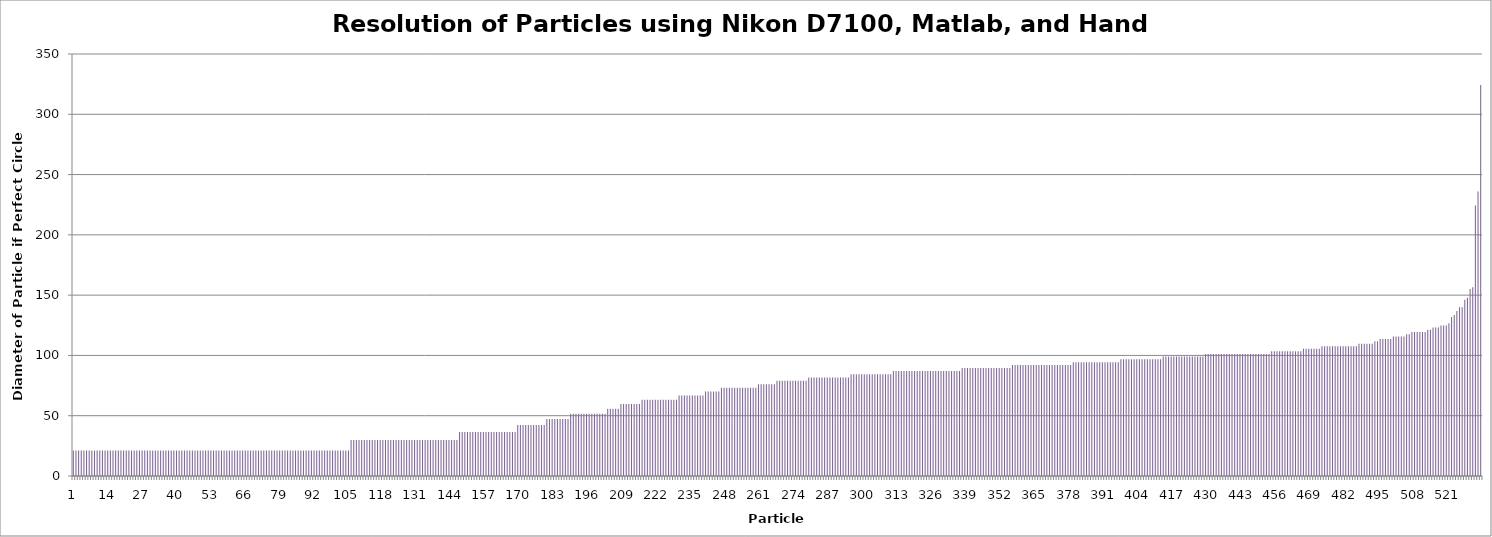
| Category | Matlab Diameter if Perfect Circle (um) |
|---|---|
| 0 | 21.11 |
| 1 | 21.11 |
| 2 | 21.11 |
| 3 | 21.11 |
| 4 | 21.11 |
| 5 | 21.11 |
| 6 | 21.11 |
| 7 | 21.11 |
| 8 | 21.11 |
| 9 | 21.11 |
| 10 | 21.11 |
| 11 | 21.11 |
| 12 | 21.11 |
| 13 | 21.11 |
| 14 | 21.11 |
| 15 | 21.11 |
| 16 | 21.11 |
| 17 | 21.11 |
| 18 | 21.11 |
| 19 | 21.11 |
| 20 | 21.11 |
| 21 | 21.11 |
| 22 | 21.11 |
| 23 | 21.11 |
| 24 | 21.11 |
| 25 | 21.11 |
| 26 | 21.11 |
| 27 | 21.11 |
| 28 | 21.11 |
| 29 | 21.11 |
| 30 | 21.11 |
| 31 | 21.11 |
| 32 | 21.11 |
| 33 | 21.11 |
| 34 | 21.11 |
| 35 | 21.11 |
| 36 | 21.11 |
| 37 | 21.11 |
| 38 | 21.11 |
| 39 | 21.11 |
| 40 | 21.11 |
| 41 | 21.11 |
| 42 | 21.11 |
| 43 | 21.11 |
| 44 | 21.11 |
| 45 | 21.11 |
| 46 | 21.11 |
| 47 | 21.11 |
| 48 | 21.11 |
| 49 | 21.11 |
| 50 | 21.11 |
| 51 | 21.11 |
| 52 | 21.11 |
| 53 | 21.11 |
| 54 | 21.11 |
| 55 | 21.11 |
| 56 | 21.11 |
| 57 | 21.11 |
| 58 | 21.11 |
| 59 | 21.11 |
| 60 | 21.11 |
| 61 | 21.11 |
| 62 | 21.11 |
| 63 | 21.11 |
| 64 | 21.11 |
| 65 | 21.11 |
| 66 | 21.11 |
| 67 | 21.11 |
| 68 | 21.11 |
| 69 | 21.11 |
| 70 | 21.11 |
| 71 | 21.11 |
| 72 | 21.11 |
| 73 | 21.11 |
| 74 | 21.11 |
| 75 | 21.11 |
| 76 | 21.11 |
| 77 | 21.11 |
| 78 | 21.11 |
| 79 | 21.11 |
| 80 | 21.11 |
| 81 | 21.11 |
| 82 | 21.11 |
| 83 | 21.11 |
| 84 | 21.11 |
| 85 | 21.11 |
| 86 | 21.11 |
| 87 | 21.11 |
| 88 | 21.11 |
| 89 | 21.11 |
| 90 | 21.11 |
| 91 | 21.11 |
| 92 | 21.11 |
| 93 | 21.11 |
| 94 | 21.11 |
| 95 | 21.11 |
| 96 | 21.11 |
| 97 | 21.11 |
| 98 | 21.11 |
| 99 | 21.11 |
| 100 | 21.11 |
| 101 | 21.11 |
| 102 | 21.11 |
| 103 | 21.11 |
| 104 | 21.11 |
| 105 | 29.854 |
| 106 | 29.854 |
| 107 | 29.854 |
| 108 | 29.854 |
| 109 | 29.854 |
| 110 | 29.854 |
| 111 | 29.854 |
| 112 | 29.854 |
| 113 | 29.854 |
| 114 | 29.854 |
| 115 | 29.854 |
| 116 | 29.854 |
| 117 | 29.854 |
| 118 | 29.854 |
| 119 | 29.854 |
| 120 | 29.854 |
| 121 | 29.854 |
| 122 | 29.854 |
| 123 | 29.854 |
| 124 | 29.854 |
| 125 | 29.854 |
| 126 | 29.854 |
| 127 | 29.854 |
| 128 | 29.854 |
| 129 | 29.854 |
| 130 | 29.854 |
| 131 | 29.854 |
| 132 | 29.854 |
| 133 | 29.854 |
| 134 | 29.854 |
| 135 | 29.854 |
| 136 | 29.854 |
| 137 | 29.854 |
| 138 | 29.854 |
| 139 | 29.854 |
| 140 | 29.854 |
| 141 | 29.854 |
| 142 | 29.854 |
| 143 | 29.854 |
| 144 | 29.854 |
| 145 | 29.854 |
| 146 | 36.564 |
| 147 | 36.564 |
| 148 | 36.564 |
| 149 | 36.564 |
| 150 | 36.564 |
| 151 | 36.564 |
| 152 | 36.564 |
| 153 | 36.564 |
| 154 | 36.564 |
| 155 | 36.564 |
| 156 | 36.564 |
| 157 | 36.564 |
| 158 | 36.564 |
| 159 | 36.564 |
| 160 | 36.564 |
| 161 | 36.564 |
| 162 | 36.564 |
| 163 | 36.564 |
| 164 | 36.564 |
| 165 | 36.564 |
| 166 | 36.564 |
| 167 | 36.564 |
| 168 | 42.22 |
| 169 | 42.22 |
| 170 | 42.22 |
| 171 | 42.22 |
| 172 | 42.22 |
| 173 | 42.22 |
| 174 | 42.22 |
| 175 | 42.22 |
| 176 | 42.22 |
| 177 | 42.22 |
| 178 | 42.22 |
| 179 | 47.204 |
| 180 | 47.204 |
| 181 | 47.204 |
| 182 | 47.204 |
| 183 | 47.204 |
| 184 | 47.204 |
| 185 | 47.204 |
| 186 | 47.204 |
| 187 | 47.204 |
| 188 | 51.709 |
| 189 | 51.709 |
| 190 | 51.709 |
| 191 | 51.709 |
| 192 | 51.709 |
| 193 | 51.709 |
| 194 | 51.709 |
| 195 | 51.709 |
| 196 | 51.709 |
| 197 | 51.709 |
| 198 | 51.709 |
| 199 | 51.709 |
| 200 | 51.709 |
| 201 | 51.709 |
| 202 | 55.852 |
| 203 | 55.852 |
| 204 | 55.852 |
| 205 | 55.852 |
| 206 | 55.852 |
| 207 | 59.708 |
| 208 | 59.708 |
| 209 | 59.708 |
| 210 | 59.708 |
| 211 | 59.708 |
| 212 | 59.708 |
| 213 | 59.708 |
| 214 | 59.708 |
| 215 | 63.33 |
| 216 | 63.33 |
| 217 | 63.33 |
| 218 | 63.33 |
| 219 | 63.33 |
| 220 | 63.33 |
| 221 | 63.33 |
| 222 | 63.33 |
| 223 | 63.33 |
| 224 | 63.33 |
| 225 | 63.33 |
| 226 | 63.33 |
| 227 | 63.33 |
| 228 | 63.33 |
| 229 | 66.756 |
| 230 | 66.756 |
| 231 | 66.756 |
| 232 | 66.756 |
| 233 | 66.756 |
| 234 | 66.756 |
| 235 | 66.756 |
| 236 | 66.756 |
| 237 | 66.756 |
| 238 | 66.756 |
| 239 | 70.014 |
| 240 | 70.014 |
| 241 | 70.014 |
| 242 | 70.014 |
| 243 | 70.014 |
| 244 | 70.014 |
| 245 | 73.128 |
| 246 | 73.128 |
| 247 | 73.128 |
| 248 | 73.128 |
| 249 | 73.128 |
| 250 | 73.128 |
| 251 | 73.128 |
| 252 | 73.128 |
| 253 | 73.128 |
| 254 | 73.128 |
| 255 | 73.128 |
| 256 | 73.128 |
| 257 | 73.128 |
| 258 | 73.128 |
| 259 | 76.114 |
| 260 | 76.114 |
| 261 | 76.114 |
| 262 | 76.114 |
| 263 | 76.114 |
| 264 | 76.114 |
| 265 | 76.114 |
| 266 | 78.987 |
| 267 | 78.987 |
| 268 | 78.987 |
| 269 | 78.987 |
| 270 | 78.987 |
| 271 | 78.987 |
| 272 | 78.987 |
| 273 | 78.987 |
| 274 | 78.987 |
| 275 | 78.987 |
| 276 | 78.987 |
| 277 | 78.987 |
| 278 | 81.759 |
| 279 | 81.759 |
| 280 | 81.759 |
| 281 | 81.759 |
| 282 | 81.759 |
| 283 | 81.759 |
| 284 | 81.759 |
| 285 | 81.759 |
| 286 | 81.759 |
| 287 | 81.759 |
| 288 | 81.759 |
| 289 | 81.759 |
| 290 | 81.759 |
| 291 | 81.759 |
| 292 | 81.759 |
| 293 | 81.759 |
| 294 | 84.441 |
| 295 | 84.441 |
| 296 | 84.441 |
| 297 | 84.441 |
| 298 | 84.441 |
| 299 | 84.441 |
| 300 | 84.441 |
| 301 | 84.441 |
| 302 | 84.441 |
| 303 | 84.441 |
| 304 | 84.441 |
| 305 | 84.441 |
| 306 | 84.441 |
| 307 | 84.441 |
| 308 | 84.441 |
| 309 | 84.441 |
| 310 | 87.039 |
| 311 | 87.039 |
| 312 | 87.039 |
| 313 | 87.039 |
| 314 | 87.039 |
| 315 | 87.039 |
| 316 | 87.039 |
| 317 | 87.039 |
| 318 | 87.039 |
| 319 | 87.039 |
| 320 | 87.039 |
| 321 | 87.039 |
| 322 | 87.039 |
| 323 | 87.039 |
| 324 | 87.039 |
| 325 | 87.039 |
| 326 | 87.039 |
| 327 | 87.039 |
| 328 | 87.039 |
| 329 | 87.039 |
| 330 | 87.039 |
| 331 | 87.039 |
| 332 | 87.039 |
| 333 | 87.039 |
| 334 | 87.039 |
| 335 | 87.039 |
| 336 | 89.563 |
| 337 | 89.563 |
| 338 | 89.563 |
| 339 | 89.563 |
| 340 | 89.563 |
| 341 | 89.563 |
| 342 | 89.563 |
| 343 | 89.563 |
| 344 | 89.563 |
| 345 | 89.563 |
| 346 | 89.563 |
| 347 | 89.563 |
| 348 | 89.563 |
| 349 | 89.563 |
| 350 | 89.563 |
| 351 | 89.563 |
| 352 | 89.563 |
| 353 | 89.563 |
| 354 | 89.563 |
| 355 | 92.017 |
| 356 | 92.017 |
| 357 | 92.017 |
| 358 | 92.017 |
| 359 | 92.017 |
| 360 | 92.017 |
| 361 | 92.017 |
| 362 | 92.017 |
| 363 | 92.017 |
| 364 | 92.017 |
| 365 | 92.017 |
| 366 | 92.017 |
| 367 | 92.017 |
| 368 | 92.017 |
| 369 | 92.017 |
| 370 | 92.017 |
| 371 | 92.017 |
| 372 | 92.017 |
| 373 | 92.017 |
| 374 | 92.017 |
| 375 | 92.017 |
| 376 | 92.017 |
| 377 | 92.017 |
| 378 | 94.407 |
| 379 | 94.407 |
| 380 | 94.407 |
| 381 | 94.407 |
| 382 | 94.407 |
| 383 | 94.407 |
| 384 | 94.407 |
| 385 | 94.407 |
| 386 | 94.407 |
| 387 | 94.407 |
| 388 | 94.407 |
| 389 | 94.407 |
| 390 | 94.407 |
| 391 | 94.407 |
| 392 | 94.407 |
| 393 | 94.407 |
| 394 | 94.407 |
| 395 | 94.407 |
| 396 | 96.739 |
| 397 | 96.739 |
| 398 | 96.739 |
| 399 | 96.739 |
| 400 | 96.739 |
| 401 | 96.739 |
| 402 | 96.739 |
| 403 | 96.739 |
| 404 | 96.739 |
| 405 | 96.739 |
| 406 | 96.739 |
| 407 | 96.739 |
| 408 | 96.739 |
| 409 | 96.739 |
| 410 | 96.739 |
| 411 | 96.739 |
| 412 | 99.015 |
| 413 | 99.015 |
| 414 | 99.015 |
| 415 | 99.015 |
| 416 | 99.015 |
| 417 | 99.015 |
| 418 | 99.015 |
| 419 | 99.015 |
| 420 | 99.015 |
| 421 | 99.015 |
| 422 | 99.015 |
| 423 | 99.015 |
| 424 | 99.015 |
| 425 | 99.015 |
| 426 | 99.015 |
| 427 | 99.015 |
| 428 | 101.241 |
| 429 | 101.241 |
| 430 | 101.241 |
| 431 | 101.241 |
| 432 | 101.241 |
| 433 | 101.241 |
| 434 | 101.241 |
| 435 | 101.241 |
| 436 | 101.241 |
| 437 | 101.241 |
| 438 | 101.241 |
| 439 | 101.241 |
| 440 | 101.241 |
| 441 | 101.241 |
| 442 | 101.241 |
| 443 | 101.241 |
| 444 | 101.241 |
| 445 | 101.241 |
| 446 | 101.241 |
| 447 | 101.241 |
| 448 | 101.241 |
| 449 | 101.241 |
| 450 | 101.241 |
| 451 | 101.241 |
| 452 | 101.241 |
| 453 | 103.418 |
| 454 | 103.418 |
| 455 | 103.418 |
| 456 | 103.418 |
| 457 | 103.418 |
| 458 | 103.418 |
| 459 | 103.418 |
| 460 | 103.418 |
| 461 | 103.418 |
| 462 | 103.418 |
| 463 | 103.418 |
| 464 | 103.418 |
| 465 | 105.551 |
| 466 | 105.551 |
| 467 | 105.551 |
| 468 | 105.551 |
| 469 | 105.551 |
| 470 | 105.551 |
| 471 | 105.551 |
| 472 | 107.641 |
| 473 | 107.641 |
| 474 | 107.641 |
| 475 | 107.641 |
| 476 | 107.641 |
| 477 | 107.641 |
| 478 | 107.641 |
| 479 | 107.641 |
| 480 | 107.641 |
| 481 | 107.641 |
| 482 | 107.641 |
| 483 | 107.641 |
| 484 | 107.641 |
| 485 | 107.641 |
| 486 | 109.692 |
| 487 | 109.692 |
| 488 | 109.692 |
| 489 | 109.692 |
| 490 | 109.692 |
| 491 | 109.692 |
| 492 | 111.704 |
| 493 | 111.704 |
| 494 | 113.682 |
| 495 | 113.682 |
| 496 | 113.682 |
| 497 | 113.682 |
| 498 | 113.682 |
| 499 | 115.625 |
| 500 | 115.625 |
| 501 | 115.625 |
| 502 | 115.625 |
| 503 | 115.625 |
| 504 | 117.536 |
| 505 | 117.536 |
| 506 | 119.417 |
| 507 | 119.417 |
| 508 | 119.417 |
| 509 | 119.417 |
| 510 | 119.417 |
| 511 | 119.417 |
| 512 | 121.269 |
| 513 | 121.269 |
| 514 | 123.092 |
| 515 | 123.092 |
| 516 | 123.092 |
| 517 | 124.889 |
| 518 | 124.889 |
| 519 | 124.889 |
| 520 | 126.661 |
| 521 | 131.833 |
| 522 | 133.512 |
| 523 | 136.809 |
| 524 | 140.029 |
| 525 | 140.029 |
| 526 | 146.255 |
| 527 | 147.771 |
| 528 | 155.127 |
| 529 | 156.557 |
| 530 | 224.404 |
| 531 | 236.019 |
| 532 | 324.3 |